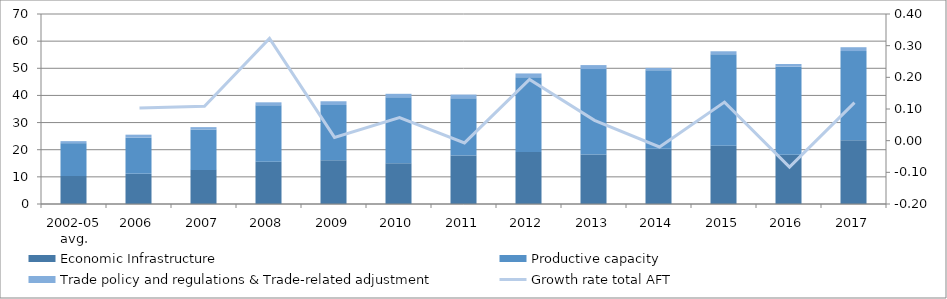
| Category | Economic Infrastructure | Productive capacity | Trade policy and regulations & Trade-related adjustment |
|---|---|---|---|
| 2002-05 avg. | 10.306 | 12.105 | 0.749 |
| 2006 | 11.101 | 13.317 | 1.123 |
| 2007 | 12.566 | 14.898 | 0.858 |
| 2008 | 15.526 | 20.834 | 1.101 |
| 2009 | 16.093 | 20.389 | 1.37 |
| 2010 | 15.055 | 24.245 | 1.299 |
| 2011 | 17.83 | 21.154 | 1.329 |
| 2012 | 19.14 | 27.587 | 1.371 |
| 2013 | 18.269 | 31.449 | 1.461 |
| 2014 | 20.339 | 28.894 | 0.926 |
| 2015 | 21.47 | 33.709 | 1.09 |
| 2016 | 18.147 | 32.448 | 0.993 |
| 2017 | 23.487 | 32.86 | 1.413 |